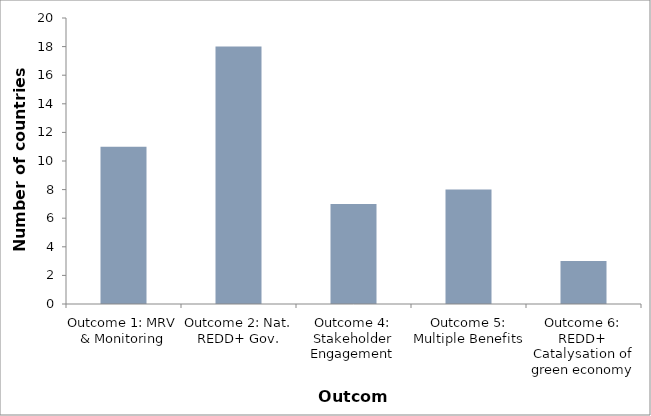
| Category | Series 0 |
|---|---|
| Outcome 1: MRV & Monitoring | 11 |
| Outcome 2: Nat. REDD+ Gov. | 18 |
| Outcome 4: Stakeholder Engagement | 7 |
| Outcome 5: Multiple Benefits | 8 |
| Outcome 6: REDD+ Catalysation of green economy | 3 |